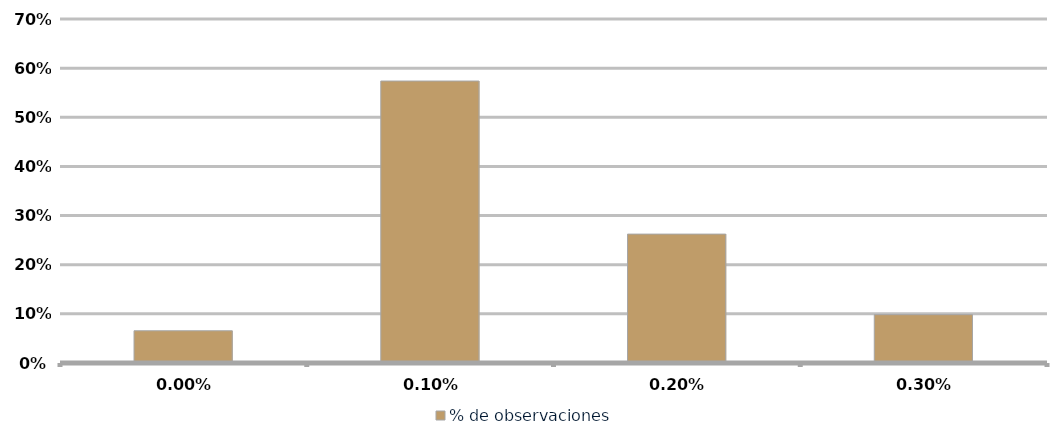
| Category | % de observaciones  |
|---|---|
| 0.0 | 0.066 |
| 0.001 | 0.574 |
| 0.002 | 0.262 |
| 0.003 | 0.098 |